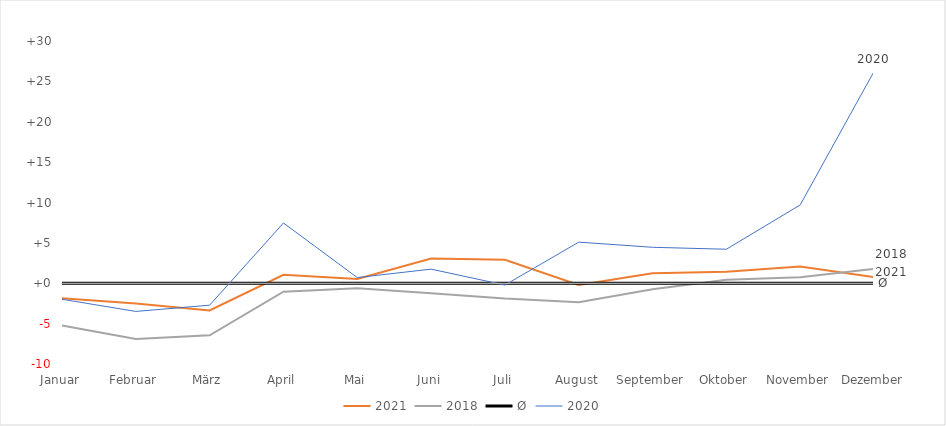
| Category | 2021 | 2018 | Ø | 2020 |
|---|---|---|---|---|
| Januar | -1858.25 | -5221.25 | 0 | -1983.25 |
| Februar | -2510 | -6900 | 0 | -3489 |
| März | -3372.25 | -6443.25 | 0 | -2715.25 |
| April | 1043 | -1052 | 0 | 7463 |
| Mai | 537.75 | -606.25 | 0 | 703.75 |
| Juni | 3072.75 | -1224.25 | 0 | 1748.75 |
| Juli | 2910 | -1894 | 0 | -221 |
| August | -205.25 | -2354.25 | 0 | 5092.75 |
| September | 1232.5 | -752.5 | 0 | 4453.5 |
| Oktober | 1437.25 | 432.25 | 0 | 4212.25 |
| November | 2083.75 | 755.75 | 0 | 9694.75 |
| Dezember | 759.75 | 1769.75 | 0 | 26222.75 |